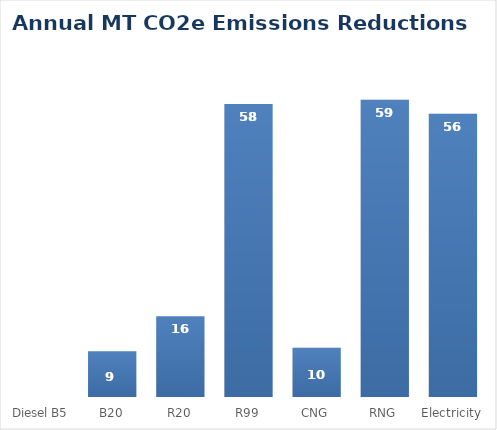
| Category | Series 0 |
|---|---|
| Diesel B5  | 0 |
| B20 | 9.039 |
| R20 | 15.975 |
| R99 | 57.916 |
| CNG | 9.751 |
| RNG | 58.774 |
| Electricity | 55.995 |